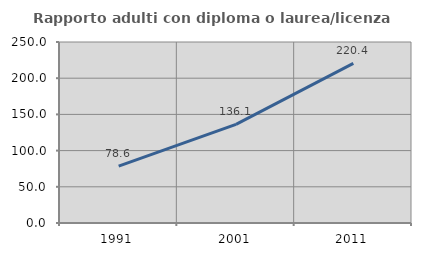
| Category | Rapporto adulti con diploma o laurea/licenza media  |
|---|---|
| 1991.0 | 78.59 |
| 2001.0 | 136.112 |
| 2011.0 | 220.429 |